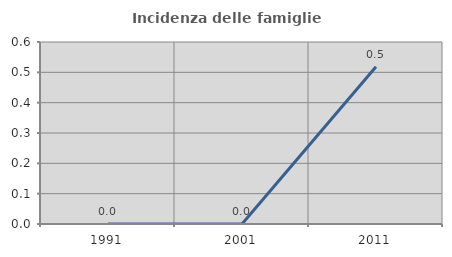
| Category | Incidenza delle famiglie numerose |
|---|---|
| 1991.0 | 0 |
| 2001.0 | 0 |
| 2011.0 | 0.518 |